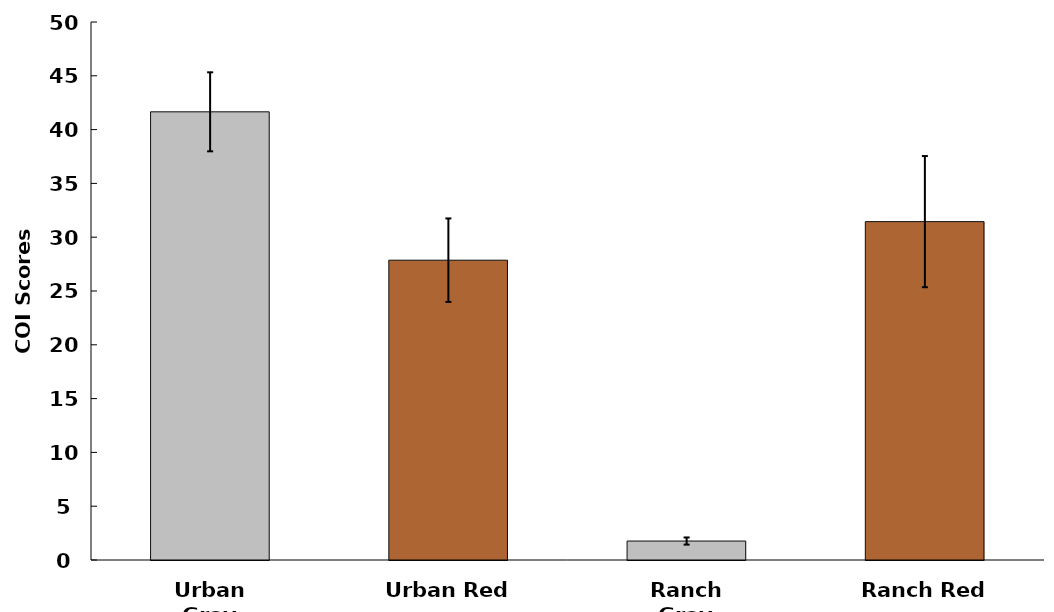
| Category | Series 0 |
|---|---|
| Urban Gray | 41.653 |
| Urban Red | 27.864 |
| Ranch Gray | 1.761 |
| Ranch Red | 31.446 |